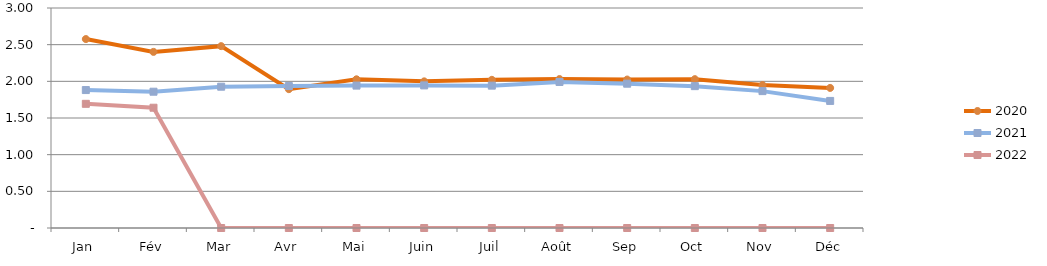
| Category | 2020 | 2021 | 2022 |
|---|---|---|---|
| Jan | 2.576 | 1.881 | 1.693 |
| Fév | 2.401 | 1.858 | 1.64 |
| Mar | 2.48 | 1.927 | 0 |
| Avr | 1.893 | 1.936 | 0 |
| Mai | 2.028 | 1.942 | 0 |
| Juin | 2 | 1.945 | 0 |
| Juil | 2.021 | 1.941 | 0 |
| Août | 2.031 | 1.991 | 0 |
| Sep | 2.024 | 1.968 | 0 |
| Oct | 2.03 | 1.934 | 0 |
| Nov | 1.95 | 1.867 | 0 |
| Déc | 1.91 | 1.733 | 0 |